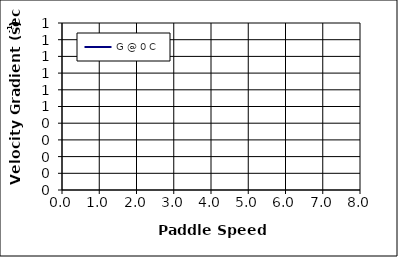
| Category | G @ 0 C |
|---|---|
| 0 | 0 |
| 1 | 0 |
| 2 | 0 |
| 3 | 0 |
| 4 | 0 |
| 5 | 0 |
| 6 | 0 |
| 7 | 0 |
| 8 | 0 |
| 9 | 0 |
| 10 | 0 |